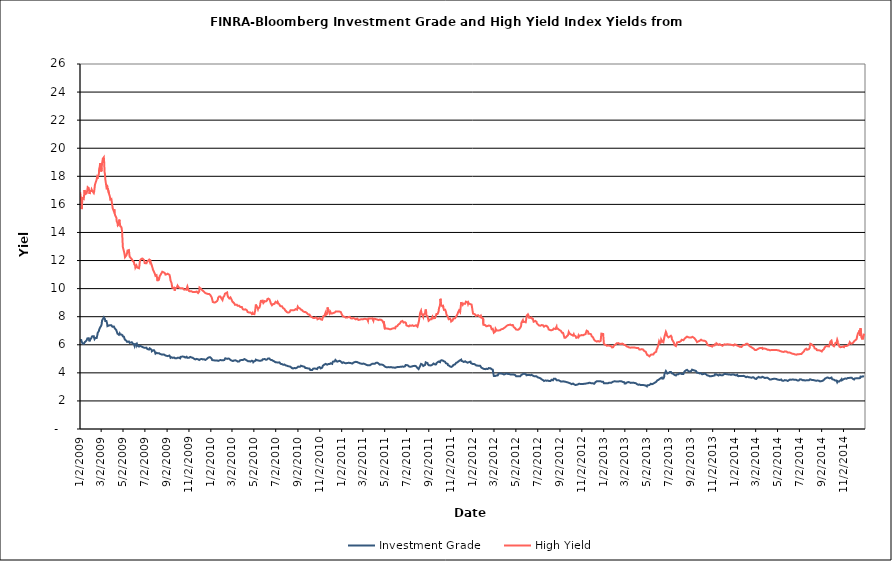
| Category | Investment Grade | High Yield |
|---|---|---|
| 1/2/09 | 6.315 | 16.861 |
| 1/5/09 | 6.33 | 16.206 |
| 1/6/09 | 6.229 | 15.663 |
| 1/7/09 | 6.168 | 15.833 |
| 1/8/09 | 6.161 | 16.527 |
| 1/9/09 | 6.092 | 16.422 |
| 1/12/09 | 6.063 | 16.382 |
| 1/13/09 | 6.088 | 16.658 |
| 1/14/09 | 6.103 | 17.023 |
| 1/15/09 | 6.192 | 17.027 |
| 1/16/09 | 6.167 | 16.724 |
| 1/20/09 | 6.312 | 16.792 |
| 1/21/09 | 6.366 | 16.863 |
| 1/22/09 | 6.454 | 17.034 |
| 1/23/09 | 6.475 | 17.224 |
| 1/26/09 | 6.463 | 17.159 |
| 1/27/09 | 6.358 | 17.14 |
| 1/28/09 | 6.246 | 16.739 |
| 1/29/09 | 6.342 | 16.834 |
| 1/30/09 | 6.403 | 16.948 |
| 2/2/09 | 6.472 | 16.946 |
| 2/3/09 | 6.531 | 17.062 |
| 2/4/09 | 6.598 | 17.006 |
| 2/5/09 | 6.616 | 16.954 |
| 2/6/09 | 6.613 | 16.934 |
| 2/9/09 | 6.61 | 16.806 |
| 2/10/09 | 6.485 | 16.911 |
| 2/11/09 | 6.407 | 17.126 |
| 2/12/09 | 6.428 | 17.35 |
| 2/13/09 | 6.493 | 17.471 |
| 2/17/09 | 6.481 | 17.777 |
| 2/18/09 | 6.592 | 17.894 |
| 2/19/09 | 6.706 | 17.814 |
| 2/20/09 | 6.854 | 17.978 |
| 2/23/09 | 6.97 | 18.135 |
| 2/24/09 | 7.069 | 18.538 |
| 2/25/09 | 7.153 | 18.613 |
| 2/26/09 | 7.214 | 18.666 |
| 2/27/09 | 7.246 | 18.936 |
| 3/2/09 | 7.38 | 18.346 |
| 3/3/09 | 7.492 | 18.591 |
| 3/4/09 | 7.718 | 18.927 |
| 3/5/09 | 7.757 | 19.05 |
| 3/6/09 | 7.761 | 19.254 |
| 3/9/09 | 7.955 | 19.354 |
| 3/10/09 | 7.96 | 18.978 |
| 3/11/09 | 7.896 | 18.32 |
| 3/12/09 | 7.827 | 18.179 |
| 3/13/09 | 7.694 | 17.809 |
| 3/16/09 | 7.699 | 17.279 |
| 3/17/09 | 7.674 | 17.219 |
| 3/18/09 | 7.533 | 17.388 |
| 3/19/09 | 7.327 | 17.067 |
| 3/20/09 | 7.38 | 17.16 |
| 3/23/09 | 7.372 | 16.803 |
| 3/24/09 | 7.392 | 16.807 |
| 3/25/09 | 7.409 | 16.736 |
| 3/26/09 | 7.39 | 16.541 |
| 3/27/09 | 7.334 | 16.346 |
| 3/30/09 | 7.389 | 16.388 |
| 3/31/09 | 7.347 | 16.392 |
| 4/1/09 | 7.325 | 16.322 |
| 4/2/09 | 7.283 | 15.853 |
| 4/3/09 | 7.321 | 15.7 |
| 4/6/09 | 7.3 | 15.51 |
| 4/7/09 | 7.28 | 15.66 |
| 4/8/09 | 7.191 | 15.475 |
| 4/9/09 | 7.134 | 15.262 |
| 4/13/09 | 7.032 | 15.042 |
| 4/14/09 | 6.943 | 14.778 |
| 4/15/09 | 6.872 | 14.816 |
| 4/16/09 | 6.796 | 14.694 |
| 4/17/09 | 6.761 | 14.496 |
| 4/20/09 | 6.712 | 14.574 |
| 4/21/09 | 6.756 | 14.916 |
| 4/22/09 | 6.808 | 14.81 |
| 4/23/09 | 6.734 | 14.592 |
| 4/24/09 | 6.721 | 14.44 |
| 4/27/09 | 6.729 | 14.38 |
| 4/28/09 | 6.724 | 14.235 |
| 4/29/09 | 6.68 | 14.054 |
| 4/30/09 | 6.676 | 13.493 |
| 5/1/09 | 6.599 | 12.962 |
| 5/4/09 | 6.574 | 12.669 |
| 5/5/09 | 6.507 | 12.615 |
| 5/6/09 | 6.406 | 12.425 |
| 5/7/09 | 6.385 | 12.24 |
| 5/8/09 | 6.334 | 12.258 |
| 5/11/09 | 6.287 | 12.378 |
| 5/12/09 | 6.242 | 12.355 |
| 5/13/09 | 6.204 | 12.542 |
| 5/14/09 | 6.255 | 12.71 |
| 5/15/09 | 6.197 | 12.673 |
| 5/18/09 | 6.234 | 12.746 |
| 5/19/09 | 6.226 | 12.486 |
| 5/20/09 | 6.136 | 12.278 |
| 5/21/09 | 6.14 | 12.286 |
| 5/22/09 | 6.134 | 12.234 |
| 5/26/09 | 6.182 | 12.093 |
| 5/27/09 | 6.184 | 12.098 |
| 5/28/09 | 6.206 | 12.104 |
| 5/29/09 | 6.079 | 11.967 |
| 6/1/09 | 6.059 | 11.892 |
| 6/2/09 | 5.973 | 11.733 |
| 6/3/09 | 5.894 | 11.719 |
| 6/4/09 | 5.936 | 11.658 |
| 6/5/09 | 6.03 | 11.494 |
| 6/8/09 | 6.077 | 11.64 |
| 6/9/09 | 5.965 | 11.621 |
| 6/10/09 | 6.037 | 11.503 |
| 6/11/09 | 5.992 | 11.454 |
| 6/12/09 | 5.925 | 11.447 |
| 6/15/09 | 5.872 | 11.448 |
| 6/16/09 | 5.864 | 11.581 |
| 6/17/09 | 5.853 | 11.826 |
| 6/18/09 | 5.929 | 12.008 |
| 6/19/09 | 5.918 | 11.97 |
| 6/22/09 | 5.879 | 12.128 |
| 6/23/09 | 5.862 | 12.194 |
| 6/24/09 | 5.869 | 12.167 |
| 6/25/09 | 5.841 | 12.138 |
| 6/26/09 | 5.794 | 12.071 |
| 6/29/09 | 5.793 | 12.039 |
| 6/30/09 | 5.798 | 11.955 |
| 7/1/09 | 5.83 | 11.816 |
| 7/2/09 | 5.786 | 11.76 |
| 7/6/09 | 5.795 | 11.808 |
| 7/7/09 | 5.767 | 11.805 |
| 7/8/09 | 5.703 | 11.934 |
| 7/9/09 | 5.709 | 11.955 |
| 7/10/09 | 5.671 | 11.931 |
| 7/13/09 | 5.66 | 12.054 |
| 7/14/09 | 5.691 | 11.992 |
| 7/15/09 | 5.747 | 11.92 |
| 7/16/09 | 5.696 | 12.069 |
| 7/17/09 | 5.69 | 11.92 |
| 7/20/09 | 5.647 | 11.712 |
| 7/21/09 | 5.538 | 11.654 |
| 7/22/09 | 5.536 | 11.651 |
| 7/23/09 | 5.591 | 11.468 |
| 7/24/09 | 5.599 | 11.352 |
| 7/27/09 | 5.607 | 11.191 |
| 7/28/09 | 5.564 | 11.179 |
| 7/29/09 | 5.524 | 11.075 |
| 7/30/09 | 5.467 | 11.006 |
| 7/31/09 | 5.368 | 10.917 |
| 8/3/09 | 5.429 | 10.958 |
| 8/4/09 | 5.428 | 10.906 |
| 8/5/09 | 5.401 | 10.893 |
| 8/6/09 | 5.4 | 10.534 |
| 8/7/09 | 5.437 | 10.739 |
| 8/10/09 | 5.401 | 10.674 |
| 8/11/09 | 5.367 | 10.78 |
| 8/12/09 | 5.399 | 10.894 |
| 8/13/09 | 5.345 | 10.905 |
| 8/14/09 | 5.296 | 10.972 |
| 8/17/09 | 5.308 | 11.106 |
| 8/18/09 | 5.307 | 11.147 |
| 8/19/09 | 5.301 | 11.205 |
| 8/20/09 | 5.298 | 11.176 |
| 8/21/09 | 5.33 | 11.182 |
| 8/24/09 | 5.304 | 11.142 |
| 8/25/09 | 5.267 | 11.115 |
| 8/26/09 | 5.236 | 11.108 |
| 8/27/09 | 5.245 | 11.081 |
| 8/28/09 | 5.235 | 10.997 |
| 8/31/09 | 5.213 | 11.021 |
| 9/1/09 | 5.232 | 11.02 |
| 9/2/09 | 5.202 | 11.044 |
| 9/3/09 | 5.191 | 11.06 |
| 9/4/09 | 5.202 | 11.006 |
| 9/8/09 | 5.234 | 10.985 |
| 9/9/09 | 5.235 | 10.91 |
| 9/10/09 | 5.149 | 10.78 |
| 9/11/09 | 5.07 | 10.585 |
| 9/14/09 | 5.11 | 10.385 |
| 9/15/09 | 5.1 | 10.217 |
| 9/16/09 | 5.078 | 10.066 |
| 9/17/09 | 5.067 | 10.122 |
| 9/18/09 | 5.072 | 10.062 |
| 9/21/09 | 5.091 | 10.07 |
| 9/22/09 | 5.085 | 9.951 |
| 9/23/09 | 5.07 | 9.857 |
| 9/24/09 | 5.035 | 10.037 |
| 9/25/09 | 5.05 | 10.083 |
| 9/28/09 | 5.034 | 10.061 |
| 9/29/09 | 5.042 | 10.055 |
| 9/30/09 | 5.055 | 10.171 |
| 10/1/09 | 5.082 | 10.052 |
| 10/2/09 | 5.076 | 10.162 |
| 10/5/09 | 5.066 | 10.066 |
| 10/6/09 | 5.068 | 10.013 |
| 10/7/09 | 5.038 | 10.066 |
| 10/8/09 | 5.036 | 10.034 |
| 10/9/09 | 5.138 | 10.037 |
| 10/12/09 | 5.151 | 10.026 |
| 10/13/09 | 5.103 | 10.048 |
| 10/14/09 | 5.128 | 10.001 |
| 10/15/09 | 5.163 | 10.022 |
| 10/16/09 | 5.154 | 9.972 |
| 10/19/09 | 5.141 | 9.925 |
| 10/20/09 | 5.071 | 9.858 |
| 10/21/09 | 5.099 | 9.94 |
| 10/22/09 | 5.09 | 9.946 |
| 10/23/09 | 5.114 | 9.99 |
| 10/26/09 | 5.147 | 9.916 |
| 10/27/09 | 5.107 | 10.08 |
| 10/28/09 | 5.067 | 10.155 |
| 10/29/09 | 5.11 | 10.095 |
| 10/30/09 | 5.056 | 9.99 |
| 11/2/09 | 5.078 | 9.82 |
| 11/3/09 | 5.113 | 9.854 |
| 11/4/09 | 5.136 | 9.849 |
| 11/5/09 | 5.135 | 9.81 |
| 11/6/09 | 5.108 | 9.824 |
| 11/9/09 | 5.091 | 9.805 |
| 11/10/09 | 5.068 | 9.772 |
| 11/11/09 | 5.102 | 9.748 |
| 11/12/09 | 5.071 | 9.754 |
| 11/13/09 | 5.054 | 9.753 |
| 11/16/09 | 5.001 | 9.765 |
| 11/17/09 | 4.975 | 9.778 |
| 11/18/09 | 4.97 | 9.788 |
| 11/19/09 | 4.957 | 9.76 |
| 11/20/09 | 4.972 | 9.793 |
| 11/23/09 | 4.994 | 9.79 |
| 11/24/09 | 4.962 | 9.811 |
| 11/25/09 | 4.96 | 9.734 |
| 11/27/09 | 4.963 | 9.684 |
| 11/30/09 | 4.915 | 9.786 |
| 12/1/09 | 4.939 | 10.073 |
| 12/2/09 | 4.94 | 10.065 |
| 12/3/09 | 4.967 | 10.023 |
| 12/4/09 | 5.032 | 10.01 |
| 12/7/09 | 4.992 | 9.922 |
| 12/8/09 | 4.947 | 9.904 |
| 12/9/09 | 4.94 | 9.872 |
| 12/10/09 | 4.958 | 9.853 |
| 12/11/09 | 4.989 | 9.846 |
| 12/14/09 | 4.963 | 9.768 |
| 12/15/09 | 4.982 | 9.73 |
| 12/16/09 | 4.971 | 9.699 |
| 12/17/09 | 4.919 | 9.682 |
| 12/18/09 | 4.909 | 9.682 |
| 12/21/09 | 4.982 | 9.649 |
| 12/22/09 | 5.034 | 9.64 |
| 12/23/09 | 5.032 | 9.648 |
| 12/24/09 | 5.058 | 9.621 |
| 12/28/09 | 5.112 | 9.617 |
| 12/29/09 | 5.106 | 9.629 |
| 12/30/09 | 5.07 | 9.575 |
| 12/31/09 | 5.105 | 9.548 |
| 1/4/10 | 4.999 | 9.369 |
| 1/5/10 | 4.915 | 9.304 |
| 1/6/10 | 4.922 | 9.169 |
| 1/7/10 | 4.901 | 9.047 |
| 1/8/10 | 4.898 | 9.058 |
| 1/11/10 | 4.889 | 9.014 |
| 1/12/10 | 4.849 | 8.983 |
| 1/13/10 | 4.867 | 8.998 |
| 1/14/10 | 4.871 | 9.02 |
| 1/15/10 | 4.832 | 9.091 |
| 1/19/10 | 4.881 | 9.112 |
| 1/20/10 | 4.852 | 9.144 |
| 1/21/10 | 4.825 | 9.212 |
| 1/22/10 | 4.854 | 9.354 |
| 1/25/10 | 4.879 | 9.444 |
| 1/26/10 | 4.876 | 9.444 |
| 1/27/10 | 4.892 | 9.447 |
| 1/28/10 | 4.912 | 9.438 |
| 1/29/10 | 4.911 | 9.441 |
| 2/1/10 | 4.898 | 9.258 |
| 2/2/10 | 4.887 | 9.234 |
| 2/3/10 | 4.905 | 9.182 |
| 2/4/10 | 4.894 | 9.243 |
| 2/5/10 | 4.893 | 9.376 |
| 2/8/10 | 4.912 | 9.483 |
| 2/9/10 | 4.939 | 9.516 |
| 2/10/10 | 4.971 | 9.639 |
| 2/11/10 | 5.039 | 9.675 |
| 2/12/10 | 4.988 | 9.653 |
| 2/16/10 | 4.997 | 9.725 |
| 2/17/10 | 4.998 | 9.538 |
| 2/18/10 | 5.011 | 9.459 |
| 2/19/10 | 5.022 | 9.382 |
| 2/22/10 | 5 | 9.304 |
| 2/23/10 | 4.958 | 9.367 |
| 2/24/10 | 4.935 | 9.339 |
| 2/25/10 | 4.92 | 9.38 |
| 2/26/10 | 4.868 | 9.358 |
| 3/1/10 | 4.871 | 9.182 |
| 3/2/10 | 4.868 | 9.1 |
| 3/3/10 | 4.852 | 9.072 |
| 3/4/10 | 4.843 | 9.086 |
| 3/5/10 | 4.878 | 9.023 |
| 3/8/10 | 4.885 | 8.941 |
| 3/9/10 | 4.872 | 8.914 |
| 3/10/10 | 4.891 | 8.842 |
| 3/11/10 | 4.893 | 8.854 |
| 3/12/10 | 4.861 | 8.844 |
| 3/15/10 | 4.852 | 8.855 |
| 3/16/10 | 4.828 | 8.822 |
| 3/17/10 | 4.8 | 8.781 |
| 3/18/10 | 4.799 | 8.748 |
| 3/19/10 | 4.808 | 8.733 |
| 3/22/10 | 4.815 | 8.778 |
| 3/23/10 | 4.809 | 8.757 |
| 3/24/10 | 4.894 | 8.699 |
| 3/25/10 | 4.937 | 8.722 |
| 3/26/10 | 4.928 | 8.701 |
| 3/29/10 | 4.919 | 8.691 |
| 3/30/10 | 4.908 | 8.658 |
| 3/31/10 | 4.877 | 8.678 |
| 4/1/10 | 4.914 | 8.523 |
| 4/5/10 | 4.983 | 8.504 |
| 4/6/10 | 4.988 | 8.531 |
| 4/7/10 | 4.95 | 8.513 |
| 4/8/10 | 4.942 | 8.525 |
| 4/9/10 | 4.93 | 8.482 |
| 4/12/10 | 4.884 | 8.459 |
| 4/13/10 | 4.857 | 8.414 |
| 4/14/10 | 4.843 | 8.332 |
| 4/15/10 | 4.829 | 8.282 |
| 4/16/10 | 4.795 | 8.274 |
| 4/19/10 | 4.827 | 8.295 |
| 4/20/10 | 4.828 | 8.274 |
| 4/21/10 | 4.8 | 8.241 |
| 4/22/10 | 4.802 | 8.303 |
| 4/23/10 | 4.852 | 8.252 |
| 4/26/10 | 4.868 | 8.194 |
| 4/27/10 | 4.82 | 8.211 |
| 4/28/10 | 4.838 | 8.267 |
| 4/29/10 | 4.826 | 8.192 |
| 4/30/10 | 4.754 | 8.225 |
| 5/3/10 | 4.831 | 8.182 |
| 5/4/10 | 4.808 | 8.233 |
| 5/5/10 | 4.814 | 8.404 |
| 5/6/10 | 4.863 | 8.601 |
| 5/7/10 | 4.939 | 8.865 |
| 5/10/10 | 4.906 | 8.687 |
| 5/11/10 | 4.915 | 8.722 |
| 5/12/10 | 4.924 | 8.609 |
| 5/13/10 | 4.885 | 8.536 |
| 5/14/10 | 4.846 | 8.618 |
| 5/17/10 | 4.86 | 8.642 |
| 5/18/10 | 4.84 | 8.689 |
| 5/19/10 | 4.848 | 8.817 |
| 5/20/10 | 4.862 | 9.024 |
| 5/21/10 | 4.898 | 9.108 |
| 5/24/10 | 4.886 | 9.066 |
| 5/25/10 | 4.956 | 9.198 |
| 5/26/10 | 4.962 | 9.128 |
| 5/27/10 | 5.008 | 9.046 |
| 5/28/10 | 4.962 | 8.975 |
| 6/1/10 | 4.985 | 9.11 |
| 6/2/10 | 5.007 | 9.12 |
| 6/3/10 | 4.998 | 9.067 |
| 6/4/10 | 4.934 | 9.086 |
| 6/7/10 | 4.943 | 9.145 |
| 6/8/10 | 4.961 | 9.251 |
| 6/9/10 | 4.962 | 9.245 |
| 6/10/10 | 5.018 | 9.225 |
| 6/11/10 | 5.016 | 9.29 |
| 6/14/10 | 5.015 | 9.235 |
| 6/15/10 | 5.01 | 9.184 |
| 6/16/10 | 4.997 | 9.102 |
| 6/17/10 | 4.929 | 9.019 |
| 6/18/10 | 4.921 | 8.943 |
| 6/21/10 | 4.912 | 8.814 |
| 6/22/10 | 4.884 | 8.838 |
| 6/23/10 | 4.85 | 8.844 |
| 6/24/10 | 4.857 | 8.898 |
| 6/25/10 | 4.859 | 8.889 |
| 6/28/10 | 4.812 | 8.913 |
| 6/29/10 | 4.792 | 8.964 |
| 6/30/10 | 4.765 | 8.929 |
| 7/1/10 | 4.749 | 9.058 |
| 7/2/10 | 4.751 | 9.06 |
| 7/6/10 | 4.744 | 8.97 |
| 7/7/10 | 4.747 | 9.049 |
| 7/8/10 | 4.738 | 8.984 |
| 7/9/10 | 4.742 | 8.945 |
| 7/12/10 | 4.745 | 8.874 |
| 7/13/10 | 4.732 | 8.787 |
| 7/14/10 | 4.726 | 8.762 |
| 7/15/10 | 4.643 | 8.764 |
| 7/16/10 | 4.608 | 8.74 |
| 7/19/10 | 4.623 | 8.743 |
| 7/20/10 | 4.602 | 8.709 |
| 7/21/10 | 4.588 | 8.733 |
| 7/22/10 | 4.579 | 8.613 |
| 7/23/10 | 4.582 | 8.602 |
| 7/26/10 | 4.589 | 8.552 |
| 7/27/10 | 4.575 | 8.506 |
| 7/28/10 | 4.574 | 8.454 |
| 7/29/10 | 4.534 | 8.491 |
| 7/30/10 | 4.477 | 8.443 |
| 8/2/10 | 4.504 | 8.321 |
| 8/3/10 | 4.467 | 8.278 |
| 8/4/10 | 4.484 | 8.304 |
| 8/5/10 | 4.473 | 8.293 |
| 8/6/10 | 4.44 | 8.299 |
| 8/9/10 | 4.454 | 8.318 |
| 8/10/10 | 4.44 | 8.314 |
| 8/11/10 | 4.421 | 8.374 |
| 8/12/10 | 4.432 | 8.464 |
| 8/13/10 | 4.416 | 8.47 |
| 8/16/10 | 4.335 | 8.467 |
| 8/17/10 | 4.344 | 8.442 |
| 8/18/10 | 4.332 | 8.461 |
| 8/19/10 | 4.31 | 8.454 |
| 8/20/10 | 4.329 | 8.479 |
| 8/23/10 | 4.349 | 8.472 |
| 8/24/10 | 4.305 | 8.515 |
| 8/25/10 | 4.309 | 8.491 |
| 8/26/10 | 4.325 | 8.543 |
| 8/27/10 | 4.393 | 8.524 |
| 8/30/10 | 4.371 | 8.5 |
| 8/31/10 | 4.342 | 8.529 |
| 9/1/10 | 4.432 | 8.714 |
| 9/2/10 | 4.446 | 8.687 |
| 9/3/10 | 4.468 | 8.632 |
| 9/7/10 | 4.432 | 8.592 |
| 9/8/10 | 4.426 | 8.613 |
| 9/9/10 | 4.476 | 8.584 |
| 9/10/10 | 4.51 | 8.5 |
| 9/13/10 | 4.474 | 8.464 |
| 9/14/10 | 4.423 | 8.499 |
| 9/15/10 | 4.426 | 8.457 |
| 9/16/10 | 4.456 | 8.38 |
| 9/17/10 | 4.449 | 8.4 |
| 9/20/10 | 4.432 | 8.328 |
| 9/21/10 | 4.401 | 8.294 |
| 9/22/10 | 4.349 | 8.309 |
| 9/23/10 | 4.339 | 8.327 |
| 9/24/10 | 4.376 | 8.318 |
| 9/27/10 | 4.332 | 8.248 |
| 9/28/10 | 4.323 | 8.271 |
| 9/29/10 | 4.314 | 8.214 |
| 9/30/10 | 4.314 | 8.164 |
| 10/1/10 | 4.294 | 8.189 |
| 10/4/10 | 4.301 | 8.149 |
| 10/5/10 | 4.278 | 8.084 |
| 10/6/10 | 4.2 | 8.041 |
| 10/7/10 | 4.192 | 8 |
| 10/8/10 | 4.171 | 7.982 |
| 10/11/10 | 4.197 | 7.961 |
| 10/12/10 | 4.208 | 7.936 |
| 10/13/10 | 4.232 | 7.914 |
| 10/14/10 | 4.294 | 7.911 |
| 10/15/10 | 4.341 | 7.938 |
| 10/18/10 | 4.312 | 7.905 |
| 10/19/10 | 4.287 | 7.938 |
| 10/20/10 | 4.287 | 7.959 |
| 10/21/10 | 4.298 | 7.945 |
| 10/22/10 | 4.301 | 7.951 |
| 10/25/10 | 4.271 | 7.898 |
| 10/26/10 | 4.326 | 7.816 |
| 10/27/10 | 4.362 | 7.843 |
| 10/28/10 | 4.348 | 7.844 |
| 10/29/10 | 4.367 | 7.853 |
| 11/1/10 | 4.41 | 7.906 |
| 11/2/10 | 4.372 | 7.909 |
| 11/3/10 | 4.352 | 7.851 |
| 11/4/10 | 4.313 | 7.812 |
| 11/5/10 | 4.348 | 7.819 |
| 11/8/10 | 4.366 | 7.782 |
| 11/9/10 | 4.411 | 7.825 |
| 11/10/10 | 4.505 | 7.954 |
| 11/11/10 | 4.497 | 7.956 |
| 11/12/10 | 4.524 | 8.056 |
| 11/15/10 | 4.605 | 8.073 |
| 11/16/10 | 4.631 | 8.181 |
| 11/17/10 | 4.596 | 8.253 |
| 11/18/10 | 4.637 | 8.124 |
| 11/19/10 | 4.608 | 8.178 |
| 11/22/10 | 4.582 | 8.201 |
| 11/23/10 | 4.557 | 8.656 |
| 11/24/10 | 4.645 | 8.606 |
| 11/26/10 | 4.636 | 8.437 |
| 11/29/10 | 4.63 | 8.235 |
| 11/30/10 | 4.615 | 8.237 |
| 12/1/10 | 4.674 | 8.34 |
| 12/2/10 | 4.685 | 8.285 |
| 12/3/10 | 4.677 | 8.227 |
| 12/6/10 | 4.64 | 8.229 |
| 12/7/10 | 4.709 | 8.208 |
| 12/8/10 | 4.799 | 8.279 |
| 12/9/10 | 4.78 | 8.261 |
| 12/10/10 | 4.795 | 8.312 |
| 12/13/10 | 4.808 | 8.292 |
| 12/14/10 | 4.858 | 8.31 |
| 12/15/10 | 4.919 | 8.361 |
| 12/16/10 | 4.915 | 8.376 |
| 12/17/10 | 4.864 | 8.387 |
| 12/20/10 | 4.795 | 8.378 |
| 12/21/10 | 4.813 | 8.392 |
| 12/22/10 | 4.8 | 8.41 |
| 12/23/10 | 4.826 | 8.364 |
| 12/27/10 | 4.857 | 8.361 |
| 12/28/10 | 4.876 | 8.299 |
| 12/29/10 | 4.839 | 8.346 |
| 12/30/10 | 4.81 | 8.33 |
| 12/31/10 | 4.776 | 8.325 |
| 1/3/11 | 4.707 | 8.102 |
| 1/4/11 | 4.687 | 8.068 |
| 1/5/11 | 4.763 | 8.023 |
| 1/6/11 | 4.756 | 8.024 |
| 1/7/11 | 4.7 | 7.997 |
| 1/10/11 | 4.699 | 7.987 |
| 1/11/11 | 4.695 | 7.979 |
| 1/12/11 | 4.706 | 7.94 |
| 1/13/11 | 4.682 | 7.933 |
| 1/14/11 | 4.658 | 7.912 |
| 1/18/11 | 4.703 | 7.948 |
| 1/19/11 | 4.671 | 7.953 |
| 1/20/11 | 4.712 | 7.966 |
| 1/21/11 | 4.718 | 7.981 |
| 1/24/11 | 4.707 | 7.988 |
| 1/25/11 | 4.673 | 7.921 |
| 1/26/11 | 4.705 | 7.926 |
| 1/27/11 | 4.696 | 7.883 |
| 1/28/11 | 4.663 | 7.93 |
| 1/31/11 | 4.66 | 7.873 |
| 2/1/11 | 4.667 | 7.931 |
| 2/2/11 | 4.688 | 7.899 |
| 2/3/11 | 4.727 | 7.911 |
| 2/4/11 | 4.77 | 7.851 |
| 2/7/11 | 4.768 | 7.858 |
| 2/8/11 | 4.779 | 7.831 |
| 2/9/11 | 4.783 | 7.823 |
| 2/10/11 | 4.785 | 7.809 |
| 2/11/11 | 4.773 | 7.839 |
| 2/14/11 | 4.764 | 7.868 |
| 2/15/11 | 4.753 | 7.851 |
| 2/16/11 | 4.745 | 7.822 |
| 2/17/11 | 4.73 | 7.77 |
| 2/18/11 | 4.739 | 7.791 |
| 2/22/11 | 4.668 | 7.795 |
| 2/23/11 | 4.665 | 7.81 |
| 2/24/11 | 4.682 | 7.83 |
| 2/25/11 | 4.655 | 7.818 |
| 2/28/11 | 4.638 | 7.808 |
| 3/1/11 | 4.589 | 7.83 |
| 3/2/11 | 4.586 | 7.834 |
| 3/3/11 | 4.664 | 7.823 |
| 3/4/11 | 4.638 | 7.821 |
| 3/7/11 | 4.629 | 7.855 |
| 3/8/11 | 4.65 | 7.805 |
| 3/9/11 | 4.614 | 7.813 |
| 3/10/11 | 4.586 | 7.838 |
| 3/11/11 | 4.543 | 7.823 |
| 3/14/11 | 4.548 | 7.811 |
| 3/15/11 | 4.542 | 7.874 |
| 3/16/11 | 4.508 | 7.69 |
| 3/17/11 | 4.538 | 7.866 |
| 3/18/11 | 4.528 | 7.809 |
| 3/21/11 | 4.536 | 7.872 |
| 3/22/11 | 4.552 | 7.838 |
| 3/23/11 | 4.57 | 7.856 |
| 3/24/11 | 4.59 | 7.865 |
| 3/25/11 | 4.62 | 7.879 |
| 3/28/11 | 4.647 | 7.882 |
| 3/29/11 | 4.677 | 7.901 |
| 3/30/11 | 4.679 | 7.889 |
| 3/31/11 | 4.641 | 7.711 |
| 4/1/11 | 4.7 | 7.847 |
| 4/4/11 | 4.648 | 7.854 |
| 4/5/11 | 4.683 | 7.823 |
| 4/6/11 | 4.708 | 7.827 |
| 4/7/11 | 4.711 | 7.823 |
| 4/8/11 | 4.712 | 7.821 |
| 4/11/11 | 4.724 | 7.795 |
| 4/12/11 | 4.686 | 7.786 |
| 4/13/11 | 4.658 | 7.811 |
| 4/14/11 | 4.675 | 7.756 |
| 4/15/11 | 4.623 | 7.772 |
| 4/18/11 | 4.582 | 7.794 |
| 4/19/11 | 4.576 | 7.741 |
| 4/20/11 | 4.584 | 7.785 |
| 4/21/11 | 4.59 | 7.782 |
| 4/25/11 | 4.582 | 7.718 |
| 4/26/11 | 4.548 | 7.699 |
| 4/27/11 | 4.587 | 7.714 |
| 4/28/11 | 4.54 | 7.566 |
| 4/29/11 | 4.516 | 7.663 |
| 5/2/11 | 4.455 | 7.147 |
| 5/3/11 | 4.438 | 7.173 |
| 5/4/11 | 4.418 | 7.156 |
| 5/5/11 | 4.409 | 7.158 |
| 5/6/11 | 4.381 | 7.124 |
| 5/9/11 | 4.396 | 7.15 |
| 5/10/11 | 4.417 | 7.107 |
| 5/11/11 | 4.414 | 7.123 |
| 5/12/11 | 4.41 | 7.139 |
| 5/13/11 | 4.401 | 7.138 |
| 5/16/11 | 4.4 | 7.101 |
| 5/17/11 | 4.361 | 7.107 |
| 5/18/11 | 4.394 | 7.121 |
| 5/19/11 | 4.411 | 7.112 |
| 5/20/11 | 4.402 | 7.124 |
| 5/23/11 | 4.383 | 7.158 |
| 5/24/11 | 4.401 | 7.152 |
| 5/25/11 | 4.403 | 7.177 |
| 5/26/11 | 4.385 | 7.173 |
| 5/27/11 | 4.38 | 7.143 |
| 5/31/11 | 4.362 | 7.166 |
| 6/1/11 | 4.344 | 7.286 |
| 6/2/11 | 4.385 | 7.311 |
| 6/3/11 | 4.4 | 7.312 |
| 6/6/11 | 4.411 | 7.332 |
| 6/7/11 | 4.412 | 7.373 |
| 6/8/11 | 4.393 | 7.424 |
| 6/9/11 | 4.408 | 7.443 |
| 6/10/11 | 4.409 | 7.449 |
| 6/13/11 | 4.428 | 7.518 |
| 6/14/11 | 4.481 | 7.547 |
| 6/15/11 | 4.453 | 7.572 |
| 6/16/11 | 4.433 | 7.65 |
| 6/17/11 | 4.436 | 7.617 |
| 6/20/11 | 4.448 | 7.694 |
| 6/21/11 | 4.448 | 7.693 |
| 6/22/11 | 4.441 | 7.662 |
| 6/23/11 | 4.436 | 7.581 |
| 6/24/11 | 4.401 | 7.57 |
| 6/27/11 | 4.464 | 7.61 |
| 6/28/11 | 4.533 | 7.562 |
| 6/29/11 | 4.56 | 7.554 |
| 6/30/11 | 4.572 | 7.548 |
| 7/1/11 | 4.575 | 7.384 |
| 7/5/11 | 4.534 | 7.342 |
| 7/6/11 | 4.512 | 7.34 |
| 7/7/11 | 4.543 | 7.321 |
| 7/8/11 | 4.46 | 7.312 |
| 7/11/11 | 4.435 | 7.38 |
| 7/12/11 | 4.423 | 7.392 |
| 7/13/11 | 4.412 | 7.35 |
| 7/14/11 | 4.442 | 7.349 |
| 7/15/11 | 4.444 | 7.365 |
| 7/18/11 | 4.469 | 7.391 |
| 7/19/11 | 4.477 | 7.395 |
| 7/20/11 | 4.455 | 7.37 |
| 7/21/11 | 4.493 | 7.342 |
| 7/22/11 | 4.456 | 7.356 |
| 7/25/11 | 4.498 | 7.349 |
| 7/26/11 | 4.489 | 7.33 |
| 7/27/11 | 4.485 | 7.366 |
| 7/28/11 | 4.473 | 7.392 |
| 7/29/11 | 4.403 | 7.402 |
| 8/1/11 | 4.339 | 7.284 |
| 8/2/11 | 4.296 | 7.374 |
| 8/3/11 | 4.278 | 7.463 |
| 8/4/11 | 4.268 | 7.586 |
| 8/5/11 | 4.337 | 7.673 |
| 8/8/11 | 4.47 | 8.204 |
| 8/9/11 | 4.498 | 8.318 |
| 8/10/11 | 4.484 | 8.332 |
| 8/11/11 | 4.637 | 8.431 |
| 8/12/11 | 4.589 | 8.274 |
| 8/15/11 | 4.581 | 8.097 |
| 8/16/11 | 4.534 | 8.082 |
| 8/17/11 | 4.488 | 7.981 |
| 8/18/11 | 4.484 | 8.141 |
| 8/19/11 | 4.517 | 8.197 |
| 8/22/11 | 4.561 | 8.236 |
| 8/23/11 | 4.649 | 8.421 |
| 8/24/11 | 4.75 | 8.512 |
| 8/25/11 | 4.714 | 8.404 |
| 8/26/11 | 4.681 | 8.072 |
| 8/29/11 | 4.694 | 8.036 |
| 8/30/11 | 4.606 | 8.007 |
| 8/31/11 | 4.58 | 7.822 |
| 9/1/11 | 4.56 | 7.707 |
| 9/2/11 | 4.535 | 7.688 |
| 9/6/11 | 4.53 | 7.822 |
| 9/7/11 | 4.537 | 7.755 |
| 9/8/11 | 4.53 | 7.77 |
| 9/9/11 | 4.539 | 7.823 |
| 9/12/11 | 4.59 | 8.004 |
| 9/13/11 | 4.632 | 7.956 |
| 9/14/11 | 4.627 | 7.884 |
| 9/15/11 | 4.663 | 7.842 |
| 9/16/11 | 4.647 | 7.838 |
| 9/19/11 | 4.601 | 7.905 |
| 9/20/11 | 4.602 | 7.867 |
| 9/21/11 | 4.585 | 7.924 |
| 9/22/11 | 4.604 | 8.111 |
| 9/23/11 | 4.687 | 8.198 |
| 9/26/11 | 4.753 | 8.2 |
| 9/27/11 | 4.796 | 8.176 |
| 9/28/11 | 4.815 | 8.306 |
| 9/29/11 | 4.804 | 8.397 |
| 9/30/11 | 4.796 | 8.597 |
| 10/3/11 | 4.758 | 8.833 |
| 10/4/11 | 4.865 | 9.274 |
| 10/5/11 | 4.896 | 9.146 |
| 10/6/11 | 4.889 | 8.849 |
| 10/7/11 | 4.896 | 8.774 |
| 10/10/11 | 4.884 | 8.759 |
| 10/11/11 | 4.92 | 8.841 |
| 10/12/11 | 4.885 | 8.668 |
| 10/13/11 | 4.832 | 8.629 |
| 10/14/11 | 4.822 | 8.488 |
| 10/17/11 | 4.787 | 8.501 |
| 10/18/11 | 4.743 | 8.518 |
| 10/19/11 | 4.691 | 8.381 |
| 10/20/11 | 4.662 | 8.288 |
| 10/21/11 | 4.653 | 8.132 |
| 10/24/11 | 4.64 | 8.041 |
| 10/25/11 | 4.55 | 7.993 |
| 10/26/11 | 4.534 | 8.05 |
| 10/27/11 | 4.537 | 7.819 |
| 10/28/11 | 4.514 | 7.833 |
| 10/31/11 | 4.455 | 7.86 |
| 11/1/11 | 4.471 | 7.807 |
| 11/2/11 | 4.431 | 7.758 |
| 11/3/11 | 4.424 | 7.657 |
| 11/4/11 | 4.48 | 7.703 |
| 11/7/11 | 4.473 | 7.73 |
| 11/8/11 | 4.523 | 7.682 |
| 11/9/11 | 4.559 | 7.869 |
| 11/10/11 | 4.597 | 7.838 |
| 11/11/11 | 4.583 | 7.822 |
| 11/14/11 | 4.608 | 7.885 |
| 11/15/11 | 4.667 | 7.952 |
| 11/16/11 | 4.662 | 7.983 |
| 11/17/11 | 4.714 | 8.039 |
| 11/18/11 | 4.723 | 8.06 |
| 11/21/11 | 4.761 | 8.201 |
| 11/22/11 | 4.803 | 8.293 |
| 11/23/11 | 4.825 | 8.322 |
| 11/25/11 | 4.849 | 8.445 |
| 11/28/11 | 4.9 | 8.329 |
| 11/29/11 | 4.907 | 8.382 |
| 11/30/11 | 4.903 | 8.311 |
| 12/1/11 | 4.944 | 9.038 |
| 12/2/11 | 4.849 | 8.95 |
| 12/5/11 | 4.824 | 8.837 |
| 12/6/11 | 4.808 | 8.852 |
| 12/7/11 | 4.815 | 8.935 |
| 12/8/11 | 4.775 | 8.944 |
| 12/9/11 | 4.824 | 8.964 |
| 12/12/11 | 4.826 | 8.918 |
| 12/13/11 | 4.814 | 8.961 |
| 12/14/11 | 4.796 | 9.072 |
| 12/15/11 | 4.771 | 9.036 |
| 12/16/11 | 4.726 | 9.006 |
| 12/19/11 | 4.72 | 9.022 |
| 12/20/11 | 4.752 | 8.926 |
| 12/21/11 | 4.762 | 9.013 |
| 12/22/11 | 4.758 | 8.997 |
| 12/23/11 | 4.785 | 8.923 |
| 12/27/11 | 4.798 | 8.891 |
| 12/28/11 | 4.696 | 8.936 |
| 12/29/11 | 4.681 | 8.906 |
| 12/30/11 | 4.631 | 8.86 |
| 1/3/12 | 4.624 | 8.216 |
| 1/4/12 | 4.644 | 8.259 |
| 1/5/12 | 4.644 | 8.232 |
| 1/6/12 | 4.626 | 8.199 |
| 1/9/12 | 4.59 | 8.152 |
| 1/10/12 | 4.585 | 8.087 |
| 1/11/12 | 4.55 | 8.061 |
| 1/12/12 | 4.527 | 8.108 |
| 1/13/12 | 4.51 | 8.124 |
| 1/17/12 | 4.51 | 8.108 |
| 1/18/12 | 4.485 | 8.052 |
| 1/19/12 | 4.488 | 8.052 |
| 1/20/12 | 4.503 | 8.047 |
| 1/23/12 | 4.499 | 7.982 |
| 1/24/12 | 4.515 | 7.979 |
| 1/25/12 | 4.463 | 8.067 |
| 1/26/12 | 4.377 | 8.005 |
| 1/27/12 | 4.344 | 7.944 |
| 1/30/12 | 4.318 | 7.856 |
| 1/31/12 | 4.288 | 7.93 |
| 2/1/12 | 4.311 | 7.42 |
| 2/2/12 | 4.283 | 7.458 |
| 2/3/12 | 4.302 | 7.45 |
| 2/6/12 | 4.261 | 7.402 |
| 2/7/12 | 4.294 | 7.41 |
| 2/8/12 | 4.264 | 7.338 |
| 2/9/12 | 4.292 | 7.322 |
| 2/10/12 | 4.28 | 7.37 |
| 2/13/12 | 4.27 | 7.333 |
| 2/14/12 | 4.268 | 7.355 |
| 2/15/12 | 4.272 | 7.348 |
| 2/16/12 | 4.34 | 7.377 |
| 2/17/12 | 4.318 | 7.315 |
| 2/21/12 | 4.326 | 7.333 |
| 2/22/12 | 4.307 | 7.259 |
| 2/23/12 | 4.289 | 7.23 |
| 2/24/12 | 4.256 | 7.113 |
| 2/27/12 | 4.227 | 7.141 |
| 2/28/12 | 4.205 | 7.128 |
| 2/29/12 | 4.196 | 7.087 |
| 3/1/12 | 3.782 | 6.859 |
| 3/2/12 | 3.739 | 6.877 |
| 3/5/12 | 3.776 | 6.946 |
| 3/6/12 | 3.792 | 7.137 |
| 3/7/12 | 3.798 | 7.084 |
| 3/8/12 | 3.816 | 7.085 |
| 3/9/12 | 3.829 | 7.01 |
| 3/12/12 | 3.82 | 7.02 |
| 3/13/12 | 3.866 | 7.002 |
| 3/14/12 | 3.94 | 6.987 |
| 3/15/12 | 3.944 | 7.022 |
| 3/16/12 | 3.939 | 7.01 |
| 3/19/12 | 3.961 | 7.042 |
| 3/20/12 | 3.981 | 7.089 |
| 3/21/12 | 3.94 | 7.051 |
| 3/22/12 | 3.95 | 7.109 |
| 3/23/12 | 3.919 | 7.133 |
| 3/26/12 | 3.924 | 7.127 |
| 3/27/12 | 3.874 | 7.107 |
| 3/28/12 | 3.883 | 7.113 |
| 3/29/12 | 3.883 | 7.181 |
| 3/30/12 | 3.888 | 7.142 |
| 4/2/12 | 3.914 | 7.257 |
| 4/3/12 | 3.93 | 7.25 |
| 4/4/12 | 3.973 | 7.286 |
| 4/5/12 | 3.958 | 7.331 |
| 4/9/12 | 3.923 | 7.398 |
| 4/10/12 | 3.915 | 7.462 |
| 4/11/12 | 3.932 | 7.466 |
| 4/12/12 | 3.927 | 7.411 |
| 4/13/12 | 3.896 | 7.375 |
| 4/16/12 | 3.885 | 7.44 |
| 4/17/12 | 3.895 | 7.391 |
| 4/18/12 | 3.887 | 7.378 |
| 4/19/12 | 3.875 | 7.389 |
| 4/20/12 | 3.891 | 7.374 |
| 4/23/12 | 3.88 | 7.407 |
| 4/24/12 | 3.89 | 7.354 |
| 4/25/12 | 3.902 | 7.283 |
| 4/26/12 | 3.877 | 7.261 |
| 4/27/12 | 3.859 | 7.23 |
| 4/30/12 | 3.838 | 7.166 |
| 5/1/12 | 3.79 | 7.111 |
| 5/2/12 | 3.763 | 7.089 |
| 5/3/12 | 3.753 | 7.084 |
| 5/4/12 | 3.741 | 7.073 |
| 5/7/12 | 3.754 | 7.065 |
| 5/8/12 | 3.736 | 7.096 |
| 5/9/12 | 3.758 | 7.133 |
| 5/10/12 | 3.764 | 7.106 |
| 5/11/12 | 3.753 | 7.114 |
| 5/14/12 | 3.761 | 7.218 |
| 5/15/12 | 3.777 | 7.243 |
| 5/16/12 | 3.834 | 7.333 |
| 5/17/12 | 3.87 | 7.578 |
| 5/18/12 | 3.902 | 7.646 |
| 5/21/12 | 3.917 | 7.752 |
| 5/22/12 | 3.933 | 7.622 |
| 5/23/12 | 3.918 | 7.682 |
| 5/24/12 | 3.937 | 7.672 |
| 5/25/12 | 3.915 | 7.64 |
| 5/29/12 | 3.905 | 7.602 |
| 5/30/12 | 3.862 | 7.632 |
| 5/31/12 | 3.826 | 7.662 |
| 6/1/12 | 3.818 | 8.092 |
| 6/4/12 | 3.85 | 8.17 |
| 6/5/12 | 3.878 | 8.21 |
| 6/6/12 | 3.886 | 8.066 |
| 6/7/12 | 3.856 | 7.931 |
| 6/8/12 | 3.836 | 7.933 |
| 6/11/12 | 3.828 | 7.914 |
| 6/12/12 | 3.856 | 7.949 |
| 6/13/12 | 3.86 | 7.943 |
| 6/14/12 | 3.863 | 7.942 |
| 6/15/12 | 3.821 | 7.87 |
| 6/18/12 | 3.8 | 7.848 |
| 6/19/12 | 3.803 | 7.732 |
| 6/20/12 | 3.792 | 7.639 |
| 6/21/12 | 3.763 | 7.625 |
| 6/22/12 | 3.773 | 7.65 |
| 6/25/12 | 3.762 | 7.701 |
| 6/26/12 | 3.776 | 7.674 |
| 6/27/12 | 3.768 | 7.646 |
| 6/28/12 | 3.751 | 7.632 |
| 6/29/12 | 3.757 | 7.535 |
| 7/2/12 | 3.673 | 7.447 |
| 7/3/12 | 3.66 | 7.406 |
| 7/5/12 | 3.651 | 7.378 |
| 7/6/12 | 3.629 | 7.342 |
| 7/9/12 | 3.611 | 7.357 |
| 7/10/12 | 3.588 | 7.354 |
| 7/11/12 | 3.572 | 7.34 |
| 7/12/12 | 3.541 | 7.402 |
| 7/13/12 | 3.535 | 7.388 |
| 7/16/12 | 3.487 | 7.396 |
| 7/17/12 | 3.48 | 7.399 |
| 7/18/12 | 3.431 | 7.363 |
| 7/19/12 | 3.418 | 7.288 |
| 7/20/12 | 3.447 | 7.314 |
| 7/23/12 | 3.462 | 7.359 |
| 7/24/12 | 3.448 | 7.378 |
| 7/25/12 | 3.445 | 7.399 |
| 7/26/12 | 3.44 | 7.346 |
| 7/27/12 | 3.483 | 7.292 |
| 7/30/12 | 3.45 | 7.246 |
| 7/31/12 | 3.416 | 7.184 |
| 8/1/12 | 3.428 | 7.092 |
| 8/2/12 | 3.414 | 7.106 |
| 8/3/12 | 3.45 | 7.088 |
| 8/6/12 | 3.418 | 7.041 |
| 8/7/12 | 3.461 | 7.003 |
| 8/8/12 | 3.479 | 7.034 |
| 8/9/12 | 3.504 | 7.035 |
| 8/10/12 | 3.473 | 7.07 |
| 8/13/12 | 3.471 | 7.073 |
| 8/14/12 | 3.518 | 7.074 |
| 8/15/12 | 3.575 | 7.155 |
| 8/16/12 | 3.592 | 7.161 |
| 8/17/12 | 3.585 | 7.148 |
| 8/20/12 | 3.578 | 7.123 |
| 8/21/12 | 3.57 | 7.089 |
| 8/22/12 | 3.519 | 7.077 |
| 8/23/12 | 3.479 | 7.292 |
| 8/24/12 | 3.488 | 7.141 |
| 8/27/12 | 3.472 | 7.141 |
| 8/28/12 | 3.462 | 7.084 |
| 8/29/12 | 3.479 | 7.101 |
| 8/30/12 | 3.462 | 7.07 |
| 8/31/12 | 3.429 | 7.058 |
| 9/4/12 | 3.381 | 6.991 |
| 9/5/12 | 3.393 | 6.999 |
| 9/6/12 | 3.42 | 6.945 |
| 9/7/12 | 3.379 | 6.864 |
| 9/10/12 | 3.397 | 6.85 |
| 9/11/12 | 3.389 | 6.773 |
| 9/12/12 | 3.394 | 6.683 |
| 9/13/12 | 3.38 | 6.624 |
| 9/14/12 | 3.386 | 6.506 |
| 9/17/12 | 3.365 | 6.507 |
| 9/18/12 | 3.349 | 6.545 |
| 9/19/12 | 3.325 | 6.538 |
| 9/20/12 | 3.34 | 6.588 |
| 9/21/12 | 3.334 | 6.594 |
| 9/24/12 | 3.314 | 6.685 |
| 9/25/12 | 3.315 | 6.734 |
| 9/26/12 | 3.304 | 6.91 |
| 9/27/12 | 3.28 | 6.846 |
| 9/28/12 | 3.261 | 6.81 |
| 10/1/12 | 3.242 | 6.745 |
| 10/2/12 | 3.225 | 6.758 |
| 10/3/12 | 3.206 | 6.729 |
| 10/4/12 | 3.198 | 6.708 |
| 10/5/12 | 3.217 | 6.665 |
| 10/8/12 | 3.234 | 6.651 |
| 10/9/12 | 3.211 | 6.699 |
| 10/10/12 | 3.215 | 6.75 |
| 10/11/12 | 3.18 | 6.673 |
| 10/12/12 | 3.137 | 6.659 |
| 10/15/12 | 3.135 | 6.614 |
| 10/16/12 | 3.134 | 6.56 |
| 10/17/12 | 3.131 | 6.493 |
| 10/18/12 | 3.149 | 6.482 |
| 10/19/12 | 3.16 | 6.522 |
| 10/22/12 | 3.183 | 6.536 |
| 10/23/12 | 3.201 | 6.636 |
| 10/24/12 | 3.205 | 6.564 |
| 10/25/12 | 3.228 | 6.597 |
| 10/26/12 | 3.2 | 6.662 |
| 10/29/12 | 3.203 | 6.656 |
| 10/30/12 | 3.206 | 6.657 |
| 10/31/12 | 3.18 | 6.676 |
| 11/1/12 | 3.205 | 6.697 |
| 11/2/12 | 3.215 | 6.665 |
| 11/5/12 | 3.207 | 6.673 |
| 11/6/12 | 3.241 | 6.638 |
| 11/7/12 | 3.226 | 6.716 |
| 11/8/12 | 3.223 | 6.722 |
| 11/9/12 | 3.226 | 6.772 |
| 11/12/12 | 3.231 | 6.76 |
| 11/13/12 | 3.234 | 6.859 |
| 11/14/12 | 3.234 | 6.896 |
| 11/15/12 | 3.248 | 7.004 |
| 11/16/12 | 3.256 | 7.034 |
| 11/19/12 | 3.264 | 6.942 |
| 11/20/12 | 3.279 | 6.776 |
| 11/21/12 | 3.306 | 6.812 |
| 11/23/12 | 3.3 | 6.777 |
| 11/26/12 | 3.276 | 6.775 |
| 11/27/12 | 3.269 | 6.718 |
| 11/28/12 | 3.258 | 6.697 |
| 11/29/12 | 3.25 | 6.607 |
| 11/30/12 | 3.244 | 6.561 |
| 12/3/12 | 3.252 | 6.521 |
| 12/4/12 | 3.247 | 6.486 |
| 12/5/12 | 3.223 | 6.392 |
| 12/6/12 | 3.219 | 6.372 |
| 12/7/12 | 3.243 | 6.317 |
| 12/10/12 | 3.35 | 6.272 |
| 12/11/12 | 3.362 | 6.245 |
| 12/12/12 | 3.371 | 6.232 |
| 12/13/12 | 3.396 | 6.227 |
| 12/14/12 | 3.383 | 6.224 |
| 12/17/12 | 3.403 | 6.265 |
| 12/18/12 | 3.431 | 6.248 |
| 12/19/12 | 3.404 | 6.208 |
| 12/20/12 | 3.399 | 6.227 |
| 12/21/12 | 3.382 | 6.275 |
| 12/24/12 | 3.403 | 6.269 |
| 12/26/12 | 3.377 | 6.796 |
| 12/27/12 | 3.36 | 6.778 |
| 12/28/12 | 3.343 | 6.772 |
| 12/31/12 | 3.362 | 6.769 |
| 1/2/13 | 3.253 | 6.097 |
| 1/3/13 | 3.262 | 6.031 |
| 1/4/13 | 3.275 | 6.009 |
| 1/7/13 | 3.263 | 5.989 |
| 1/8/13 | 3.254 | 5.982 |
| 1/9/13 | 3.254 | 5.981 |
| 1/10/13 | 3.263 | 5.936 |
| 1/11/13 | 3.269 | 5.922 |
| 1/14/13 | 3.266 | 5.942 |
| 1/15/13 | 3.27 | 5.969 |
| 1/16/13 | 3.27 | 5.969 |
| 1/17/13 | 3.3 | 5.937 |
| 1/18/13 | 3.291 | 5.899 |
| 1/22/13 | 3.284 | 5.903 |
| 1/23/13 | 3.277 | 5.86 |
| 1/24/13 | 3.294 | 5.846 |
| 1/25/13 | 3.332 | 5.809 |
| 1/28/13 | 3.372 | 5.827 |
| 1/29/13 | 3.379 | 5.889 |
| 1/30/13 | 3.401 | 5.942 |
| 1/31/13 | 3.394 | 6.003 |
| 2/1/13 | 3.393 | 5.96 |
| 2/4/13 | 3.392 | 6.024 |
| 2/5/13 | 3.412 | 6.065 |
| 2/6/13 | 3.397 | 6.086 |
| 2/7/13 | 3.382 | 6.107 |
| 2/8/13 | 3.395 | 6.111 |
| 2/11/13 | 3.385 | 6.118 |
| 2/12/13 | 3.399 | 6.096 |
| 2/13/13 | 3.412 | 6.09 |
| 2/14/13 | 3.398 | 6.075 |
| 2/15/13 | 3.402 | 6.08 |
| 2/19/13 | 3.405 | 6.055 |
| 2/20/13 | 3.406 | 6.039 |
| 2/21/13 | 3.382 | 6.101 |
| 2/22/13 | 3.373 | 6.085 |
| 2/25/13 | 3.342 | 6.054 |
| 2/26/13 | 3.328 | 6.07 |
| 2/27/13 | 3.332 | 6.052 |
| 2/28/13 | 3.335 | 5.988 |
| 3/1/13 | 3.239 | 5.98 |
| 3/4/13 | 3.242 | 5.966 |
| 3/5/13 | 3.255 | 5.902 |
| 3/6/13 | 3.279 | 5.894 |
| 3/7/13 | 3.308 | 5.863 |
| 3/8/13 | 3.345 | 5.861 |
| 3/11/13 | 3.345 | 5.841 |
| 3/12/13 | 3.32 | 5.826 |
| 3/13/13 | 3.327 | 5.822 |
| 3/14/13 | 3.328 | 5.799 |
| 3/15/13 | 3.305 | 5.794 |
| 3/18/13 | 3.284 | 5.795 |
| 3/19/13 | 3.26 | 5.788 |
| 3/20/13 | 3.291 | 5.81 |
| 3/21/13 | 3.296 | 5.805 |
| 3/22/13 | 3.302 | 5.8 |
| 3/25/13 | 3.303 | 5.814 |
| 3/26/13 | 3.312 | 5.815 |
| 3/27/13 | 3.283 | 5.806 |
| 3/28/13 | 3.28 | 5.806 |
| 4/1/13 | 3.264 | 5.782 |
| 4/2/13 | 3.274 | 5.776 |
| 4/3/13 | 3.242 | 5.781 |
| 4/4/13 | 3.202 | 5.769 |
| 4/5/13 | 3.149 | 5.775 |
| 4/8/13 | 3.151 | 5.769 |
| 4/9/13 | 3.146 | 5.733 |
| 4/10/13 | 3.17 | 5.712 |
| 4/11/13 | 3.172 | 5.667 |
| 4/12/13 | 3.142 | 5.651 |
| 4/15/13 | 3.128 | 5.669 |
| 4/16/13 | 3.134 | 5.653 |
| 4/17/13 | 3.128 | 5.675 |
| 4/18/13 | 3.127 | 5.689 |
| 4/19/13 | 3.135 | 5.67 |
| 4/22/13 | 3.126 | 5.653 |
| 4/23/13 | 3.117 | 5.6 |
| 4/24/13 | 3.105 | 5.569 |
| 4/25/13 | 3.125 | 5.572 |
| 4/26/13 | 3.092 | 5.534 |
| 4/29/13 | 3.087 | 5.499 |
| 4/30/13 | 3.086 | 5.43 |
| 5/1/13 | 3.067 | 5.368 |
| 5/2/13 | 3.036 | 5.305 |
| 5/3/13 | 3.109 | 5.266 |
| 5/6/13 | 3.117 | 5.244 |
| 5/7/13 | 3.136 | 5.201 |
| 5/8/13 | 3.129 | 5.184 |
| 5/9/13 | 3.131 | 5.173 |
| 5/10/13 | 3.19 | 5.221 |
| 5/13/13 | 3.224 | 5.288 |
| 5/14/13 | 3.228 | 5.326 |
| 5/15/13 | 3.223 | 5.334 |
| 5/16/13 | 3.19 | 5.306 |
| 5/17/13 | 3.218 | 5.305 |
| 5/20/13 | 3.234 | 5.306 |
| 5/21/13 | 3.229 | 5.314 |
| 5/22/13 | 3.258 | 5.327 |
| 5/23/13 | 3.284 | 5.429 |
| 5/24/13 | 3.284 | 5.465 |
| 5/28/13 | 3.36 | 5.504 |
| 5/29/13 | 3.404 | 5.657 |
| 5/30/13 | 3.413 | 5.675 |
| 5/31/13 | 3.463 | 5.748 |
| 6/3/13 | 3.494 | 5.995 |
| 6/4/13 | 3.522 | 6.063 |
| 6/5/13 | 3.552 | 6.239 |
| 6/6/13 | 3.551 | 6.291 |
| 6/7/13 | 3.57 | 6.113 |
| 6/10/13 | 3.628 | 6.164 |
| 6/11/13 | 3.681 | 6.371 |
| 6/12/13 | 3.674 | 6.305 |
| 6/13/13 | 3.66 | 6.359 |
| 6/14/13 | 3.588 | 6.227 |
| 6/17/13 | 3.599 | 6.175 |
| 6/18/13 | 3.646 | 6.192 |
| 6/19/13 | 3.69 | 6.237 |
| 6/20/13 | 3.91 | 6.572 |
| 6/21/13 | 3.967 | 6.634 |
| 6/24/13 | 4.127 | 6.924 |
| 6/25/13 | 4.1 | 6.906 |
| 6/26/13 | 4.034 | 6.807 |
| 6/27/13 | 3.965 | 6.661 |
| 6/28/13 | 3.948 | 6.621 |
| 7/1/13 | 3.98 | 6.527 |
| 7/2/13 | 3.946 | 6.515 |
| 7/3/13 | 3.938 | 6.511 |
| 7/5/13 | 4.063 | 6.58 |
| 7/8/13 | 4.062 | 6.64 |
| 7/9/13 | 4.028 | 6.597 |
| 7/10/13 | 4.031 | 6.565 |
| 7/11/13 | 3.96 | 6.376 |
| 7/12/13 | 3.939 | 6.31 |
| 7/15/13 | 3.925 | 6.216 |
| 7/16/13 | 3.898 | 6.158 |
| 7/17/13 | 3.86 | 6.1 |
| 7/18/13 | 3.855 | 5.979 |
| 7/19/13 | 3.825 | 5.96 |
| 7/22/13 | 3.811 | 5.908 |
| 7/23/13 | 3.816 | 5.902 |
| 7/24/13 | 3.884 | 6.035 |
| 7/25/13 | 3.915 | 6.163 |
| 7/26/13 | 3.885 | 6.171 |
| 7/29/13 | 3.902 | 6.194 |
| 7/30/13 | 3.908 | 6.189 |
| 7/31/13 | 3.941 | 6.239 |
| 8/1/13 | 3.969 | 6.199 |
| 8/2/13 | 3.925 | 6.226 |
| 8/5/13 | 3.944 | 6.265 |
| 8/6/13 | 3.953 | 6.313 |
| 8/7/13 | 3.934 | 6.358 |
| 8/8/13 | 3.913 | 6.344 |
| 8/9/13 | 3.916 | 6.347 |
| 8/12/13 | 3.923 | 6.324 |
| 8/13/13 | 4.006 | 6.362 |
| 8/14/13 | 4.018 | 6.359 |
| 8/15/13 | 4.099 | 6.426 |
| 8/16/13 | 4.129 | 6.46 |
| 8/19/13 | 4.18 | 6.522 |
| 8/20/13 | 4.155 | 6.544 |
| 8/21/13 | 4.183 | 6.569 |
| 8/22/13 | 4.211 | 6.583 |
| 8/23/13 | 4.166 | 6.552 |
| 8/26/13 | 4.123 | 6.531 |
| 8/27/13 | 4.082 | 6.547 |
| 8/28/13 | 4.096 | 6.551 |
| 8/29/13 | 4.092 | 6.517 |
| 8/30/13 | 4.071 | 6.478 |
| 9/3/13 | 4.136 | 6.523 |
| 9/4/13 | 4.142 | 6.53 |
| 9/5/13 | 4.228 | 6.578 |
| 9/6/13 | 4.2 | 6.565 |
| 9/9/13 | 4.187 | 6.515 |
| 9/10/13 | 4.229 | 6.522 |
| 9/11/13 | 4.208 | 6.505 |
| 9/12/13 | 4.17 | 6.461 |
| 9/13/13 | 4.184 | 6.455 |
| 9/16/13 | 4.128 | 6.326 |
| 9/17/13 | 4.134 | 6.364 |
| 9/18/13 | 4.104 | 6.315 |
| 9/19/13 | 4.011 | 6.189 |
| 9/20/13 | 4.008 | 6.188 |
| 9/23/13 | 3.998 | 6.249 |
| 9/24/13 | 3.96 | 6.231 |
| 9/25/13 | 3.94 | 6.257 |
| 9/26/13 | 3.957 | 6.271 |
| 9/27/13 | 3.951 | 6.297 |
| 9/30/13 | 3.97 | 6.364 |
| 10/1/13 | 3.942 | 6.375 |
| 10/2/13 | 3.916 | 6.359 |
| 10/3/13 | 3.897 | 6.31 |
| 10/4/13 | 3.925 | 6.295 |
| 10/7/13 | 3.916 | 6.288 |
| 10/8/13 | 3.924 | 6.308 |
| 10/9/13 | 3.938 | 6.326 |
| 10/10/13 | 3.948 | 6.286 |
| 10/11/13 | 3.91 | 6.244 |
| 10/14/13 | 3.897 | 6.226 |
| 10/15/13 | 3.933 | 6.22 |
| 10/16/13 | 3.91 | 6.161 |
| 10/17/13 | 3.823 | 6.063 |
| 10/18/13 | 3.753 | 5.992 |
| 10/21/13 | 3.801 | 5.954 |
| 10/22/13 | 3.751 | 5.916 |
| 10/23/13 | 3.738 | 5.926 |
| 10/24/13 | 3.757 | 5.93 |
| 10/25/13 | 3.752 | 5.918 |
| 10/28/13 | 3.76 | 5.906 |
| 10/29/13 | 3.759 | 5.89 |
| 10/30/13 | 3.742 | 5.891 |
| 10/31/13 | 3.771 | 5.876 |
| 11/1/13 | 3.795 | 5.951 |
| 11/4/13 | 3.796 | 5.939 |
| 11/5/13 | 3.844 | 5.976 |
| 11/6/13 | 3.827 | 5.962 |
| 11/7/13 | 3.813 | 5.955 |
| 11/8/13 | 3.899 | 6.033 |
| 11/11/13 | 3.894 | 6.024 |
| 11/12/13 | 3.936 | 6.103 |
| 11/13/13 | 3.906 | 6.126 |
| 11/14/13 | 3.856 | 6.076 |
| 11/15/13 | 3.848 | 6.045 |
| 11/18/13 | 3.809 | 5.992 |
| 11/19/13 | 3.825 | 6.008 |
| 11/20/13 | 3.853 | 6.015 |
| 11/21/13 | 3.879 | 6.04 |
| 11/22/13 | 3.847 | 5.999 |
| 11/25/13 | 3.821 | 5.98 |
| 11/26/13 | 3.799 | 5.977 |
| 11/27/13 | 3.816 | 5.936 |
| 11/29/13 | 3.822 | 5.927 |
| 12/2/13 | 3.881 | 5.994 |
| 12/3/13 | 3.869 | 5.992 |
| 12/4/13 | 3.91 | 6.015 |
| 12/5/13 | 3.928 | 6.031 |
| 12/6/13 | 3.927 | 6.016 |
| 12/9/13 | 3.91 | 6.018 |
| 12/10/13 | 3.87 | 5.984 |
| 12/11/13 | 3.872 | 5.997 |
| 12/12/13 | 3.9 | 6.039 |
| 12/13/13 | 3.895 | 6.03 |
| 12/16/13 | 3.878 | 6.026 |
| 12/17/13 | 3.858 | 6.027 |
| 12/18/13 | 3.859 | 6.033 |
| 12/19/13 | 3.878 | 6.024 |
| 12/20/13 | 3.856 | 6.016 |
| 12/23/13 | 3.857 | 5.993 |
| 12/24/13 | 3.875 | 5.996 |
| 12/26/13 | 3.89 | 5.991 |
| 12/27/13 | 3.903 | 5.977 |
| 12/30/13 | 3.883 | 5.95 |
| 12/31/13 | 3.873 | 5.948 |
| 1/2/14 | 3.844 | 6.025 |
| 1/3/14 | 3.842 | 6.009 |
| 1/6/14 | 3.825 | 5.995 |
| 1/7/14 | 3.818 | 5.951 |
| 1/8/14 | 3.87 | 5.943 |
| 1/9/14 | 3.864 | 5.942 |
| 1/10/14 | 3.79 | 5.914 |
| 1/13/14 | 3.762 | 5.905 |
| 1/14/14 | 3.784 | 5.909 |
| 1/15/14 | 3.803 | 5.867 |
| 1/16/14 | 3.78 | 5.861 |
| 1/17/14 | 3.766 | 5.831 |
| 1/21/14 | 3.774 | 5.843 |
| 1/22/14 | 3.801 | 5.829 |
| 1/23/14 | 3.784 | 5.857 |
| 1/24/14 | 3.772 | 5.948 |
| 1/27/14 | 3.786 | 5.982 |
| 1/28/14 | 3.782 | 5.991 |
| 1/29/14 | 3.754 | 6.003 |
| 1/30/14 | 3.748 | 5.991 |
| 1/31/14 | 3.738 | 6.016 |
| 2/3/14 | 3.69 | 6.066 |
| 2/4/14 | 3.699 | 6.082 |
| 2/5/14 | 3.722 | 6.098 |
| 2/6/14 | 3.728 | 6.079 |
| 2/7/14 | 3.695 | 6.015 |
| 2/10/14 | 3.691 | 5.986 |
| 2/11/14 | 3.713 | 5.962 |
| 2/12/14 | 3.724 | 5.911 |
| 2/13/14 | 3.68 | 5.9 |
| 2/14/14 | 3.672 | 5.865 |
| 2/18/14 | 3.652 | 5.821 |
| 2/19/14 | 3.651 | 5.805 |
| 2/20/14 | 3.695 | 5.797 |
| 2/21/14 | 3.681 | 5.767 |
| 2/24/14 | 3.677 | 5.721 |
| 2/25/14 | 3.637 | 5.673 |
| 2/26/14 | 3.618 | 5.653 |
| 2/27/14 | 3.595 | 5.636 |
| 2/28/14 | 3.598 | 5.604 |
| 3/3/14 | 3.563 | 5.628 |
| 3/4/14 | 3.601 | 5.616 |
| 3/5/14 | 3.613 | 5.618 |
| 3/6/14 | 3.649 | 5.671 |
| 3/7/14 | 3.701 | 5.709 |
| 3/10/14 | 3.709 | 5.736 |
| 3/11/14 | 3.709 | 5.734 |
| 3/12/14 | 3.691 | 5.747 |
| 3/13/14 | 3.664 | 5.765 |
| 3/14/14 | 3.655 | 5.799 |
| 3/17/14 | 3.663 | 5.765 |
| 3/18/14 | 3.661 | 5.749 |
| 3/19/14 | 3.675 | 5.728 |
| 3/20/14 | 3.72 | 5.777 |
| 3/21/14 | 3.695 | 5.705 |
| 3/24/14 | 3.678 | 5.735 |
| 3/25/14 | 3.669 | 5.735 |
| 3/26/14 | 3.626 | 5.694 |
| 3/27/14 | 3.629 | 5.724 |
| 3/28/14 | 3.647 | 5.698 |
| 3/31/14 | 3.652 | 5.7 |
| 4/1/14 | 3.641 | 5.714 |
| 4/2/14 | 3.676 | 5.658 |
| 4/3/14 | 3.658 | 5.653 |
| 4/4/14 | 3.612 | 5.634 |
| 4/7/14 | 3.582 | 5.65 |
| 4/8/14 | 3.577 | 5.642 |
| 4/9/14 | 3.572 | 5.618 |
| 4/10/14 | 3.527 | 5.604 |
| 4/11/14 | 3.519 | 5.647 |
| 4/14/14 | 3.533 | 5.622 |
| 4/15/14 | 3.529 | 5.639 |
| 4/16/14 | 3.534 | 5.633 |
| 4/17/14 | 3.562 | 5.633 |
| 4/21/14 | 3.574 | 5.631 |
| 4/22/14 | 3.588 | 5.628 |
| 4/23/14 | 3.564 | 5.628 |
| 4/24/14 | 3.572 | 5.628 |
| 4/25/14 | 3.554 | 5.625 |
| 4/28/14 | 3.568 | 5.63 |
| 4/29/14 | 3.582 | 5.617 |
| 4/30/14 | 3.551 | 5.598 |
| 5/1/14 | 3.522 | 5.612 |
| 5/2/14 | 3.506 | 5.584 |
| 5/5/14 | 3.507 | 5.594 |
| 5/6/14 | 3.51 | 5.583 |
| 5/7/14 | 3.506 | 5.579 |
| 5/8/14 | 3.493 | 5.562 |
| 5/9/14 | 3.498 | 5.534 |
| 5/12/14 | 3.526 | 5.525 |
| 5/13/14 | 3.501 | 5.514 |
| 5/14/14 | 3.446 | 5.488 |
| 5/15/14 | 3.426 | 5.499 |
| 5/16/14 | 3.439 | 5.512 |
| 5/19/14 | 3.443 | 5.491 |
| 5/20/14 | 3.448 | 5.508 |
| 5/21/14 | 3.47 | 5.5 |
| 5/22/14 | 3.482 | 5.53 |
| 5/23/14 | 3.463 | 5.526 |
| 5/27/14 | 3.462 | 5.512 |
| 5/28/14 | 3.401 | 5.487 |
| 5/29/14 | 3.398 | 5.479 |
| 5/30/14 | 3.421 | 5.443 |
| 6/2/14 | 3.475 | 5.453 |
| 6/3/14 | 3.517 | 5.48 |
| 6/4/14 | 3.528 | 5.481 |
| 6/5/14 | 3.519 | 5.441 |
| 6/6/14 | 3.499 | 5.411 |
| 6/9/14 | 3.513 | 5.394 |
| 6/10/14 | 3.532 | 5.381 |
| 6/11/14 | 3.523 | 5.359 |
| 6/12/14 | 3.523 | 5.362 |
| 6/13/14 | 3.519 | 5.366 |
| 6/16/14 | 3.516 | 5.346 |
| 6/17/14 | 3.546 | 5.364 |
| 6/18/14 | 3.533 | 5.363 |
| 6/19/14 | 3.511 | 5.314 |
| 6/20/14 | 3.523 | 5.304 |
| 6/23/14 | 3.501 | 5.294 |
| 6/24/14 | 3.494 | 5.293 |
| 6/25/14 | 3.465 | 5.304 |
| 6/26/14 | 3.453 | 5.321 |
| 6/27/14 | 3.457 | 5.324 |
| 6/30/14 | 3.458 | 5.329 |
| 7/1/14 | 3.475 | 5.317 |
| 7/2/14 | 3.514 | 5.332 |
| 7/3/14 | 3.538 | 5.336 |
| 7/7/14 | 3.53 | 5.343 |
| 7/8/14 | 3.473 | 5.364 |
| 7/9/14 | 3.502 | 5.384 |
| 7/10/14 | 3.481 | 5.427 |
| 7/11/14 | 3.466 | 5.431 |
| 7/14/14 | 3.482 | 5.531 |
| 7/15/14 | 3.497 | 5.553 |
| 7/16/14 | 3.49 | 5.582 |
| 7/17/14 | 3.459 | 5.665 |
| 7/18/14 | 3.469 | 5.704 |
| 7/21/14 | 3.467 | 5.719 |
| 7/22/14 | 3.458 | 5.682 |
| 7/23/14 | 3.443 | 5.641 |
| 7/24/14 | 3.478 | 5.654 |
| 7/25/14 | 3.446 | 5.658 |
| 7/28/14 | 3.469 | 5.688 |
| 7/29/14 | 3.455 | 5.7 |
| 7/30/14 | 3.506 | 5.764 |
| 7/31/14 | 3.543 | 5.968 |
| 8/1/14 | 3.525 | 6.073 |
| 8/4/14 | 3.505 | 6.045 |
| 8/5/14 | 3.517 | 5.981 |
| 8/6/14 | 3.51 | 5.994 |
| 8/7/14 | 3.485 | 5.965 |
| 8/8/14 | 3.464 | 5.953 |
| 8/11/14 | 3.48 | 5.889 |
| 8/12/14 | 3.494 | 5.843 |
| 8/13/14 | 3.476 | 5.746 |
| 8/14/14 | 3.454 | 5.721 |
| 8/15/14 | 3.415 | 5.695 |
| 8/18/14 | 3.436 | 5.699 |
| 8/19/14 | 3.443 | 5.618 |
| 8/20/14 | 3.467 | 5.635 |
| 8/21/14 | 3.456 | 5.605 |
| 8/22/14 | 3.449 | 5.612 |
| 8/25/14 | 3.437 | 5.607 |
| 8/26/14 | 3.427 | 5.585 |
| 8/27/14 | 3.422 | 5.589 |
| 8/28/14 | 3.39 | 5.591 |
| 8/29/14 | 3.388 | 5.58 |
| 9/2/14 | 3.417 | 5.521 |
| 9/3/14 | 3.422 | 5.55 |
| 9/4/14 | 3.455 | 5.611 |
| 9/5/14 | 3.442 | 5.659 |
| 9/8/14 | 3.508 | 5.69 |
| 9/9/14 | 3.502 | 5.725 |
| 9/10/14 | 3.526 | 5.811 |
| 9/11/14 | 3.592 | 5.863 |
| 9/12/14 | 3.644 | 5.879 |
| 9/15/14 | 3.645 | 5.918 |
| 9/16/14 | 3.638 | 5.941 |
| 9/17/14 | 3.642 | 5.916 |
| 9/18/14 | 3.672 | 5.895 |
| 9/19/14 | 3.648 | 5.863 |
| 9/22/14 | 3.624 | 5.882 |
| 9/23/14 | 3.611 | 5.959 |
| 9/24/14 | 3.634 | 6.004 |
| 9/25/14 | 3.622 | 6.133 |
| 9/26/14 | 3.675 | 6.226 |
| 9/29/14 | 3.665 | 6.297 |
| 9/30/14 | 3.666 | 6.198 |
| 10/1/14 | 3.546 | 6.041 |
| 10/2/14 | 3.543 | 6.033 |
| 10/3/14 | 3.562 | 5.951 |
| 10/6/14 | 3.511 | 5.891 |
| 10/7/14 | 3.49 | 5.942 |
| 10/8/14 | 3.476 | 5.966 |
| 10/9/14 | 3.455 | 6.047 |
| 10/10/14 | 3.455 | 6.125 |
| 10/13/14 | 3.455 | 6.126 |
| 10/14/14 | 3.415 | 6.254 |
| 10/15/14 | 3.322 | 6.366 |
| 10/16/14 | 3.392 | 6.295 |
| 10/17/14 | 3.405 | 6.024 |
| 10/20/14 | 3.378 | 6.011 |
| 10/21/14 | 3.408 | 5.869 |
| 10/22/14 | 3.423 | 5.856 |
| 10/23/14 | 3.438 | 5.833 |
| 10/24/14 | 3.46 | 5.826 |
| 10/27/14 | 3.549 | 5.844 |
| 10/28/14 | 3.47 | 5.831 |
| 10/29/14 | 3.508 | 5.854 |
| 10/30/14 | 3.484 | 5.863 |
| 10/31/14 | 3.523 | 5.818 |
| 11/3/14 | 3.563 | 5.828 |
| 11/4/14 | 3.561 | 5.914 |
| 11/5/14 | 3.58 | 5.896 |
| 11/6/14 | 3.597 | 5.904 |
| 11/7/14 | 3.571 | 5.919 |
| 11/10/14 | 3.581 | 5.911 |
| 11/11/14 | 3.58 | 5.894 |
| 11/12/14 | 3.61 | 5.917 |
| 11/13/14 | 3.63 | 5.944 |
| 11/14/14 | 3.622 | 5.986 |
| 11/17/14 | 3.639 | 6.05 |
| 11/18/14 | 3.664 | 6.114 |
| 11/19/14 | 3.676 | 6.183 |
| 11/20/14 | 3.645 | 6.193 |
| 11/21/14 | 3.61 | 6.102 |
| 11/24/14 | 3.655 | 6.077 |
| 11/25/14 | 3.614 | 6.062 |
| 11/26/14 | 3.592 | 6.055 |
| 11/28/14 | 3.571 | 6.136 |
| 12/1/14 | 3.527 | 6.244 |
| 12/2/14 | 3.592 | 6.31 |
| 12/3/14 | 3.6 | 6.3 |
| 12/4/14 | 3.583 | 6.311 |
| 12/5/14 | 3.624 | 6.33 |
| 12/8/14 | 3.613 | 6.401 |
| 12/9/14 | 3.596 | 6.533 |
| 12/10/14 | 3.594 | 6.652 |
| 12/11/14 | 3.607 | 6.697 |
| 12/12/14 | 3.574 | 6.816 |
| 12/15/14 | 3.61 | 6.93 |
| 12/16/14 | 3.622 | 7.031 |
| 12/17/14 | 3.611 | 6.874 |
| 12/18/14 | 3.64 | 6.631 |
| 12/19/14 | 3.733 | 7.172 |
| 12/22/14 | 3.718 | 6.524 |
| 12/23/14 | 3.739 | 6.429 |
| 12/24/14 | 3.766 | 6.426 |
| 12/26/14 | 3.758 | 6.424 |
| 12/29/14 | 3.733 | 6.787 |
| 12/30/14 | 3.701 | 6.803 |
| 12/31/14 | 3.703 | 6.802 |